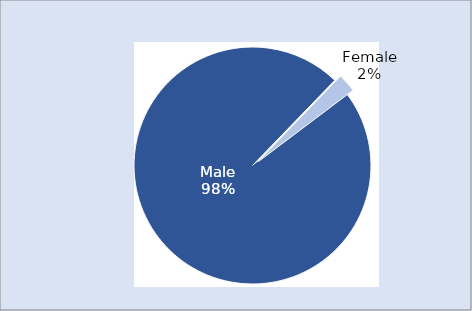
| Category | Series 0 |
|---|---|
| Male | 97.506 |
| Female | 2.494 |